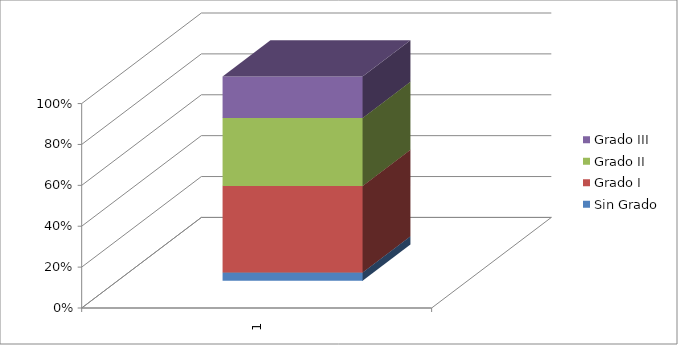
| Category | Sin Grado | Grado I | Grado II | Grado III |
|---|---|---|---|---|
| 0 | 0.044 | 0.454 | 0.358 | 0.218 |